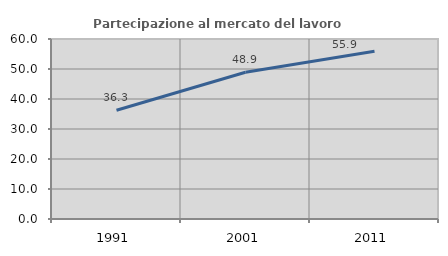
| Category | Partecipazione al mercato del lavoro  femminile |
|---|---|
| 1991.0 | 36.26 |
| 2001.0 | 48.917 |
| 2011.0 | 55.918 |